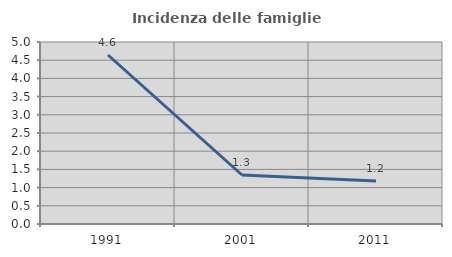
| Category | Incidenza delle famiglie numerose |
|---|---|
| 1991.0 | 4.643 |
| 2001.0 | 1.346 |
| 2011.0 | 1.181 |